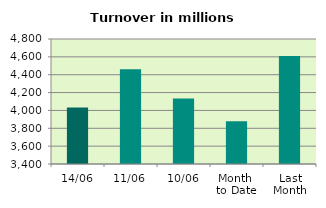
| Category | Series 0 |
|---|---|
| 14/06 | 4032.897 |
| 11/06 | 4460.329 |
| 10/06 | 4133.832 |
| Month 
to Date | 3879.256 |
| Last
Month | 4609.327 |